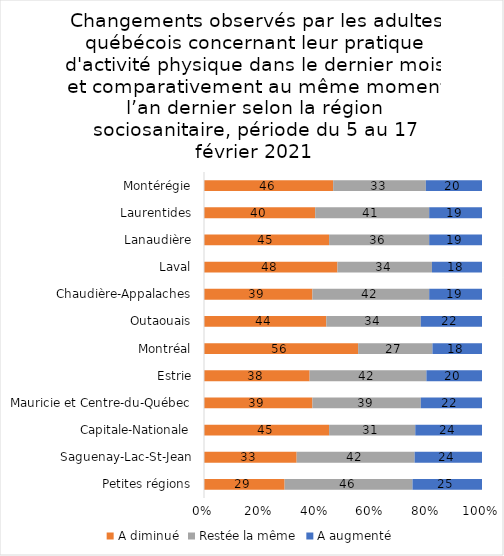
| Category | A diminué | Restée la même | A augmenté |
|---|---|---|---|
| Petites régions | 29 | 46 | 25 |
| Saguenay-Lac-St-Jean | 33 | 42 | 24 |
| Capitale-Nationale | 45 | 31 | 24 |
| Mauricie et Centre-du-Québec | 39 | 39 | 22 |
| Estrie | 38 | 42 | 20 |
| Montréal | 56 | 27 | 18 |
| Outaouais | 44 | 34 | 22 |
| Chaudière-Appalaches | 39 | 42 | 19 |
| Laval | 48 | 34 | 18 |
| Lanaudière | 45 | 36 | 19 |
| Laurentides | 40 | 41 | 19 |
| Montérégie | 46 | 33 | 20 |